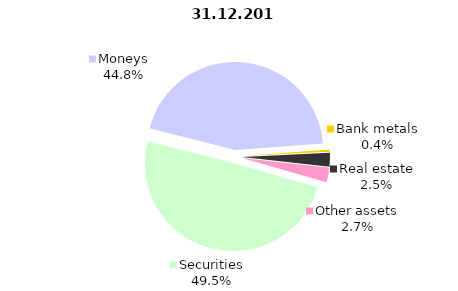
| Category | 31.12.2017 |
|---|---|
| Securities | 1221.6 |
| Moneys | 1105.5 |
| Bank metals | 10.1 |
| Real estate | 62.6 |
| Other assets | 65.8 |